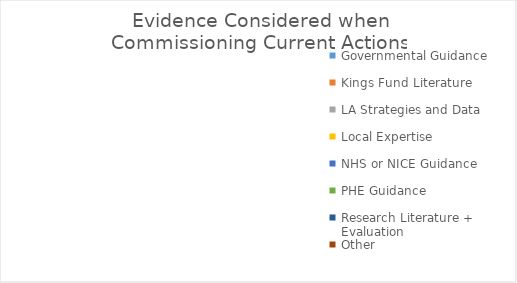
| Category | Series 0 |
|---|---|
| Governmental Guidance | 0 |
| Kings Fund Literature | 0 |
| LA Strategies and Data | 0 |
| Local Expertise | 0 |
| NHS or NICE Guidance | 0 |
| PHE Guidance | 0 |
| Research Literature + Evaluation | 0 |
| Other | 0 |